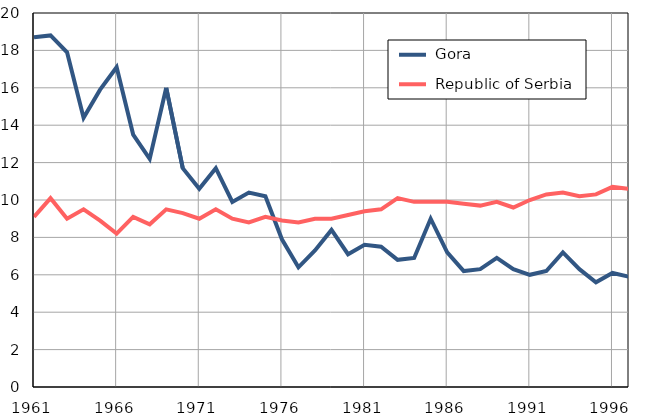
| Category |  Gora |  Republic of Serbia |
|---|---|---|
| 1961.0 | 18.7 | 9.1 |
| 1962.0 | 18.8 | 10.1 |
| 1963.0 | 17.9 | 9 |
| 1964.0 | 14.4 | 9.5 |
| 1965.0 | 15.9 | 8.9 |
| 1966.0 | 17.1 | 8.2 |
| 1967.0 | 13.5 | 9.1 |
| 1968.0 | 12.2 | 8.7 |
| 1969.0 | 16 | 9.5 |
| 1970.0 | 11.7 | 9.3 |
| 1971.0 | 10.6 | 9 |
| 1972.0 | 11.7 | 9.5 |
| 1973.0 | 9.9 | 9 |
| 1974.0 | 10.4 | 8.8 |
| 1975.0 | 10.2 | 9.1 |
| 1976.0 | 7.9 | 8.9 |
| 1977.0 | 6.4 | 8.8 |
| 1978.0 | 7.3 | 9 |
| 1979.0 | 8.4 | 9 |
| 1980.0 | 7.1 | 9.2 |
| 1981.0 | 7.6 | 9.4 |
| 1982.0 | 7.5 | 9.5 |
| 1983.0 | 6.8 | 10.1 |
| 1984.0 | 6.9 | 9.9 |
| 1985.0 | 9 | 9.9 |
| 1986.0 | 7.2 | 9.9 |
| 1987.0 | 6.2 | 9.8 |
| 1988.0 | 6.3 | 9.7 |
| 1989.0 | 6.9 | 9.9 |
| 1990.0 | 6.3 | 9.6 |
| 1991.0 | 6 | 10 |
| 1992.0 | 6.2 | 10.3 |
| 1993.0 | 7.2 | 10.4 |
| 1994.0 | 6.3 | 10.2 |
| 1995.0 | 5.6 | 10.3 |
| 1996.0 | 6.1 | 10.7 |
| 1997.0 | 5.9 | 10.6 |